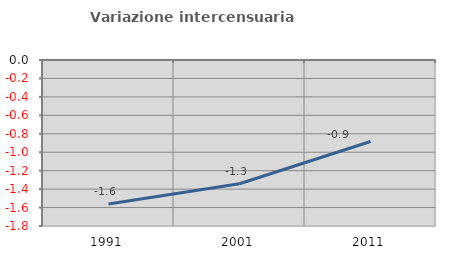
| Category | Variazione intercensuaria annua |
|---|---|
| 1991.0 | -1.561 |
| 2001.0 | -1.342 |
| 2011.0 | -0.883 |